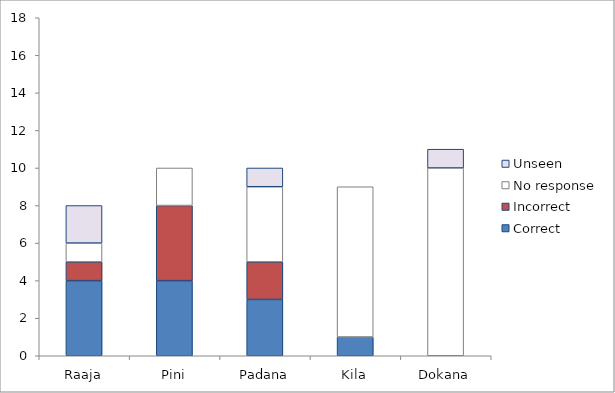
| Category | Correct | Incorrect | No response | Unseen |
|---|---|---|---|---|
| Raaja | 4 | 1 | 1 | 2 |
| Pini | 4 | 4 | 2 | 0 |
| Padana | 3 | 2 | 4 | 1 |
| Kila | 1 | 0 | 8 | 0 |
| Dokana | 0 | 0 | 10 | 1 |